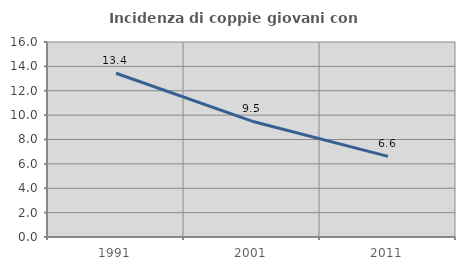
| Category | Incidenza di coppie giovani con figli |
|---|---|
| 1991.0 | 13.437 |
| 2001.0 | 9.503 |
| 2011.0 | 6.618 |